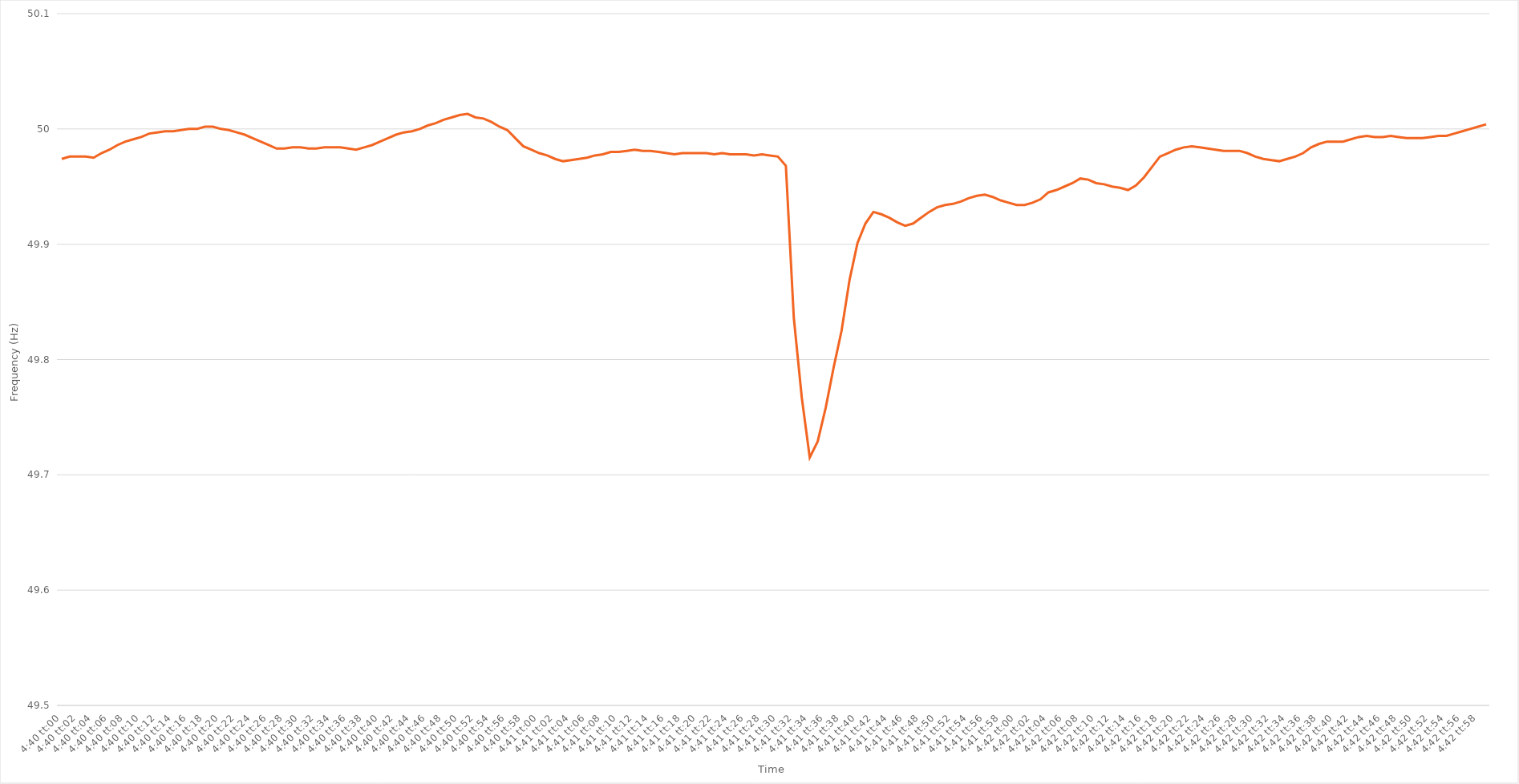
| Category | Series 0 |
|---|---|
| 0.19444444444444445 | 49.974 |
| 0.19445601851851854 | 49.976 |
| 0.19446759259259258 | 49.976 |
| 0.19447916666666668 | 49.976 |
| 0.19449074074074071 | 49.975 |
| 0.19450231481481484 | 49.979 |
| 0.19451388888888888 | 49.982 |
| 0.19452546296296294 | 49.986 |
| 0.19453703703703704 | 49.989 |
| 0.1945486111111111 | 49.991 |
| 0.19456018518518517 | 49.993 |
| 0.19457175925925926 | 49.996 |
| 0.19458333333333333 | 49.997 |
| 0.1945949074074074 | 49.998 |
| 0.1946064814814815 | 49.998 |
| 0.19461805555555556 | 49.999 |
| 0.19462962962962962 | 50 |
| 0.19464120370370372 | 50 |
| 0.19465277777777779 | 50.002 |
| 0.19466435185185185 | 50.002 |
| 0.19467592592592595 | 50 |
| 0.1946875 | 49.999 |
| 0.19469907407407408 | 49.997 |
| 0.19471064814814812 | 49.995 |
| 0.19472222222222224 | 49.992 |
| 0.19473379629629628 | 49.989 |
| 0.19474537037037035 | 49.986 |
| 0.19475694444444444 | 49.983 |
| 0.1947685185185185 | 49.983 |
| 0.19478009259259257 | 49.984 |
| 0.19479166666666667 | 49.984 |
| 0.19480324074074074 | 49.983 |
| 0.1948148148148148 | 49.983 |
| 0.1948263888888889 | 49.984 |
| 0.19483796296296296 | 49.984 |
| 0.19484953703703703 | 49.984 |
| 0.19486111111111112 | 49.983 |
| 0.1948726851851852 | 49.982 |
| 0.19488425925925926 | 49.984 |
| 0.19489583333333335 | 49.986 |
| 0.19490740740740742 | 49.989 |
| 0.19491898148148148 | 49.992 |
| 0.19493055555555558 | 49.995 |
| 0.19494212962962965 | 49.997 |
| 0.19495370370370368 | 49.998 |
| 0.1949652777777778 | 50 |
| 0.19497685185185185 | 50.003 |
| 0.1949884259259259 | 50.005 |
| 0.19499999999999998 | 50.008 |
| 0.19501157407407407 | 50.01 |
| 0.19502314814814814 | 50.012 |
| 0.1950347222222222 | 50.013 |
| 0.1950462962962963 | 50.01 |
| 0.19505787037037037 | 50.009 |
| 0.19506944444444443 | 50.006 |
| 0.19508101851851853 | 50.002 |
| 0.1950925925925926 | 49.999 |
| 0.19510416666666666 | 49.992 |
| 0.19511574074074076 | 49.985 |
| 0.19512731481481482 | 49.982 |
| 0.1951388888888889 | 49.979 |
| 0.19515046296296298 | 49.977 |
| 0.19516203703703705 | 49.974 |
| 0.1951736111111111 | 49.972 |
| 0.1951851851851852 | 49.973 |
| 0.19519675925925925 | 49.974 |
| 0.19520833333333334 | 49.975 |
| 0.19521990740740738 | 49.977 |
| 0.19523148148148148 | 49.978 |
| 0.19524305555555554 | 49.98 |
| 0.1952546296296296 | 49.98 |
| 0.1952662037037037 | 49.981 |
| 0.19527777777777777 | 49.982 |
| 0.19528935185185184 | 49.981 |
| 0.19530092592592593 | 49.981 |
| 0.1953125 | 49.98 |
| 0.19532407407407407 | 49.979 |
| 0.19533564814814816 | 49.978 |
| 0.19534722222222223 | 49.979 |
| 0.1953587962962963 | 49.979 |
| 0.1953703703703704 | 49.979 |
| 0.19538194444444446 | 49.979 |
| 0.19539351851851852 | 49.978 |
| 0.19540509259259262 | 49.979 |
| 0.19541666666666666 | 49.978 |
| 0.19542824074074075 | 49.978 |
| 0.1954398148148148 | 49.978 |
| 0.1954513888888889 | 49.977 |
| 0.19546296296296295 | 49.978 |
| 0.19547453703703702 | 49.977 |
| 0.1954861111111111 | 49.976 |
| 0.19549768518518518 | 49.968 |
| 0.19550925925925924 | 49.836 |
| 0.19552083333333334 | 49.767 |
| 0.1955324074074074 | 49.715 |
| 0.19554398148148147 | 49.729 |
| 0.19555555555555557 | 49.758 |
| 0.19556712962962963 | 49.793 |
| 0.1955787037037037 | 49.825 |
| 0.1955902777777778 | 49.869 |
| 0.19560185185185186 | 49.901 |
| 0.19561342592592593 | 49.918 |
| 0.19562500000000002 | 49.928 |
| 0.1956365740740741 | 49.926 |
| 0.19564814814814815 | 49.923 |
| 0.1956597222222222 | 49.919 |
| 0.19567129629629632 | 49.916 |
| 0.19568287037037035 | 49.918 |
| 0.19569444444444442 | 49.923 |
| 0.19570601851851852 | 49.928 |
| 0.19571759259259258 | 49.932 |
| 0.19572916666666665 | 49.934 |
| 0.19574074074074074 | 49.935 |
| 0.1957523148148148 | 49.937 |
| 0.19576388888888888 | 49.94 |
| 0.19577546296296297 | 49.942 |
| 0.19578703703703704 | 49.943 |
| 0.1957986111111111 | 49.941 |
| 0.1958101851851852 | 49.938 |
| 0.19582175925925926 | 49.936 |
| 0.19583333333333333 | 49.934 |
| 0.19584490740740743 | 49.934 |
| 0.1958564814814815 | 49.936 |
| 0.19586805555555556 | 49.939 |
| 0.19587962962962965 | 49.945 |
| 0.19589120370370372 | 49.947 |
| 0.19590277777777776 | 49.95 |
| 0.19591435185185188 | 49.953 |
| 0.19592592592592592 | 49.957 |
| 0.1959375 | 49.956 |
| 0.19594907407407405 | 49.953 |
| 0.19596064814814815 | 49.952 |
| 0.19597222222222221 | 49.95 |
| 0.19598379629629628 | 49.949 |
| 0.19599537037037038 | 49.947 |
| 0.19600694444444444 | 49.951 |
| 0.1960185185185185 | 49.958 |
| 0.1960300925925926 | 49.967 |
| 0.19604166666666667 | 49.976 |
| 0.19605324074074074 | 49.979 |
| 0.19606481481481483 | 49.982 |
| 0.1960763888888889 | 49.984 |
| 0.19608796296296296 | 49.985 |
| 0.19609953703703706 | 49.984 |
| 0.19611111111111112 | 49.983 |
| 0.19612268518518516 | 49.982 |
| 0.19613425925925929 | 49.981 |
| 0.19614583333333332 | 49.981 |
| 0.19615740740740742 | 49.981 |
| 0.19616898148148146 | 49.979 |
| 0.19618055555555555 | 49.976 |
| 0.19619212962962962 | 49.974 |
| 0.19620370370370369 | 49.973 |
| 0.19621527777777778 | 49.972 |
| 0.19622685185185185 | 49.974 |
| 0.1962384259259259 | 49.976 |
| 0.19625 | 49.979 |
| 0.19626157407407407 | 49.984 |
| 0.19627314814814814 | 49.987 |
| 0.19628472222222224 | 49.989 |
| 0.1962962962962963 | 49.989 |
| 0.19630787037037037 | 49.989 |
| 0.19631944444444446 | 49.991 |
| 0.19633101851851853 | 49.993 |
| 0.1963425925925926 | 49.994 |
| 0.1963541666666667 | 49.993 |
| 0.19636574074074073 | 49.993 |
| 0.19637731481481482 | 49.994 |
| 0.19638888888888886 | 49.993 |
| 0.19640046296296299 | 49.992 |
| 0.19641203703703702 | 49.992 |
| 0.1964236111111111 | 49.992 |
| 0.19643518518518518 | 49.993 |
| 0.19644675925925925 | 49.994 |
| 0.19645833333333332 | 49.994 |
| 0.1964699074074074 | 49.996 |
| 0.19648148148148148 | 49.998 |
| 0.19649305555555555 | 50 |
| 0.19650462962962964 | 50.002 |
| 0.1965162037037037 | 50.004 |